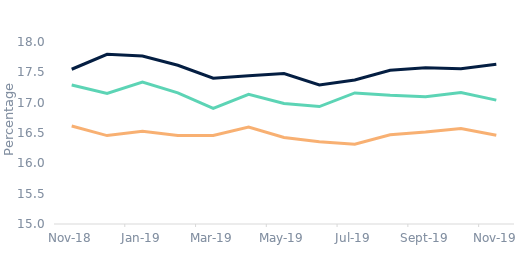
| Category | Homemovers | First-time
buyers | Remortgagors |
|---|---|---|---|
| 2018-11-01 | 17.29 | 17.551 | 16.616 |
| 2018-12-01 | 17.153 | 17.798 | 16.457 |
| 2019-01-01 | 17.341 | 17.77 | 16.528 |
| 2019-02-01 | 17.162 | 17.616 | 16.461 |
| 2019-03-01 | 16.904 | 17.402 | 16.46 |
| 2019-04-01 | 17.137 | 17.443 | 16.596 |
| 2019-05-01 | 16.986 | 17.481 | 16.425 |
| 2019-06-01 | 16.936 | 17.291 | 16.358 |
| 2019-07-01 | 17.16 | 17.374 | 16.314 |
| 2019-08-01 | 17.122 | 17.533 | 16.472 |
| 2019-09-01 | 17.096 | 17.576 | 16.515 |
| 2019-10-01 | 17.166 | 17.56 | 16.575 |
| 2019-11-01 | 17.041 | 17.632 | 16.463 |